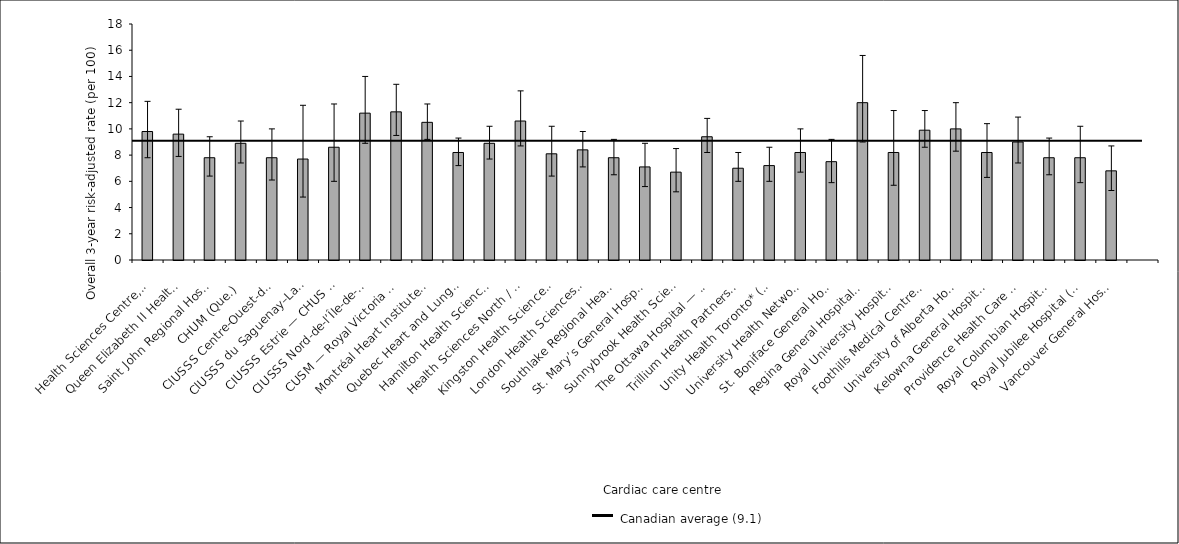
| Category | Risk-adjusted rate |
|---|---|
| Health Sciences Centre, St. John’s (N.L.) | 9.8 |
| Queen Elizabeth II Health Sciences Centre (N.S.) | 9.6 |
| Saint John Regional Hospital (N.B.) | 7.8 |
| CHUM (Que.) | 8.9 |
| CIUSSS Centre-Ouest-de-l’Île-de-Montréal — Jewish General Hospital (Que.) | 7.8 |
| CIUSSS du Saguenay–Lac-St-Jean — Chicoutimi Hospital (Que.) | 7.7 |
| CIUSSS Estrie — CHUS — Fleurimont Hospital (Que.) | 8.6 |
| CIUSSS Nord-de-l’Île-de-Montréal — Montréal Sacré-Coeur Hospital (Que.) | 11.2 |
| CUSM — Royal Victoria Hospital* (Que.) | 11.3 |
| Montréal Heart Institute* (Que.) | 10.5 |
| Quebec Heart and Lung Institute (Que.) | 8.2 |
| Hamilton Health Sciences (Ont.) | 8.9 |
| Health Sciences North / Horizon Santé-Nord (Ont.) | 10.6 |
| Kingston Health Sciences Centre (Ont.) | 8.1 |
| London Health Sciences Centre (Ont.) | 8.4 |
| Southlake Regional Health Centre (Ont.) | 7.8 |
| St. Mary’s General Hospital* (Ont.) | 7.1 |
| Sunnybrook Health Sciences Centre* (Ont.) | 6.7 |
| The Ottawa Hospital — University of Ottawa Heart Institute (Ont.) | 9.4 |
| Trillium Health Partners* (Ont.) | 7 |
| Unity Health Toronto* (Ont.) | 7.2 |
| University Health Network (Ont.) | 8.2 |
| St. Boniface General Hospital (Man.) | 7.5 |
| Regina General Hospital (Sask.) | 12 |
| Royal University Hospital (Sask.) | 8.2 |
| Foothills Medical Centre (Alta.) | 9.9 |
| University of Alberta Hospital (Alta.) | 10 |
| Kelowna General Hospital (B.C.) | 8.2 |
| Providence Health Care — St. Paul’s Hospital (Vancouver) (B.C.) | 9 |
| Royal Columbian Hospital (B.C.) | 7.8 |
| Royal Jubilee Hospital (B.C.) | 7.8 |
| Vancouver General Hospital* (B.C.) | 6.8 |